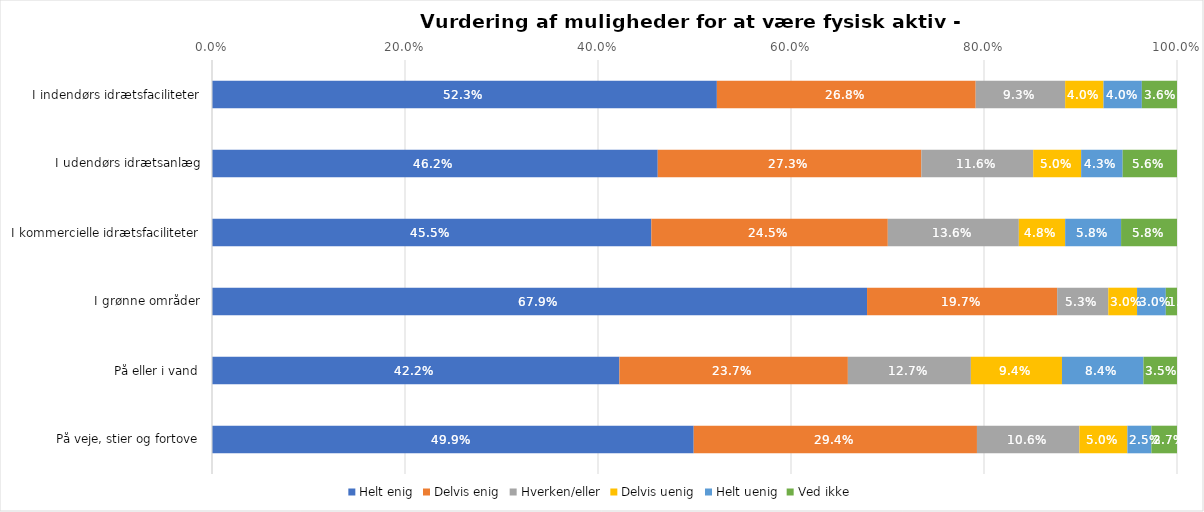
| Category | Helt enig | Delvis enig | Hverken/eller | Delvis uenig | Helt uenig | Ved ikke |
|---|---|---|---|---|---|---|
| I indendørs idrætsfaciliteter | 0.523 | 0.268 | 0.093 | 0.04 | 0.04 | 0.036 |
| I udendørs idrætsanlæg | 0.462 | 0.273 | 0.116 | 0.05 | 0.043 | 0.056 |
| I kommercielle idrætsfaciliteter | 0.455 | 0.245 | 0.136 | 0.048 | 0.058 | 0.058 |
| I grønne områder | 0.679 | 0.197 | 0.053 | 0.03 | 0.03 | 0.012 |
| På eller i vand | 0.422 | 0.237 | 0.127 | 0.094 | 0.084 | 0.035 |
| På veje, stier og fortove | 0.499 | 0.294 | 0.106 | 0.05 | 0.025 | 0.027 |